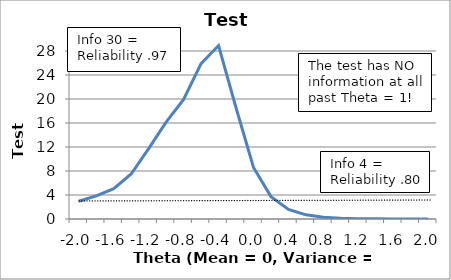
| Category | Test Information |
|---|---|
| -2.0 | 2.951 |
| -1.8 | 3.844 |
| -1.6 | 5.046 |
| -1.4 | 7.5 |
| -1.2 | 11.72 |
| -1.0 | 16.15 |
| -0.8 | 19.92 |
| -0.6 | 25.901 |
| -0.4 | 28.904 |
| -0.2 | 18.547 |
| 0.0 | 8.588 |
| 0.2 | 3.726 |
| 0.4 | 1.607 |
| 0.6 | 0.695 |
| 0.8 | 0.303 |
| 1.0 | 0.133 |
| 1.2 | 0.059 |
| 1.4 | 0.026 |
| 1.6 | 0.012 |
| 1.8 | 0.005 |
| 2.0 | 0.002 |